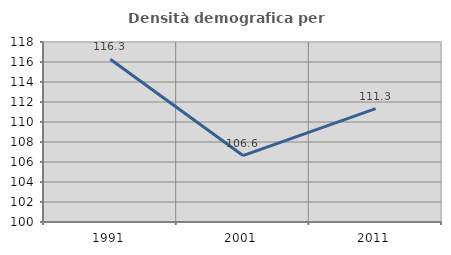
| Category | Densità demografica |
|---|---|
| 1991.0 | 116.283 |
| 2001.0 | 106.645 |
| 2011.0 | 111.339 |